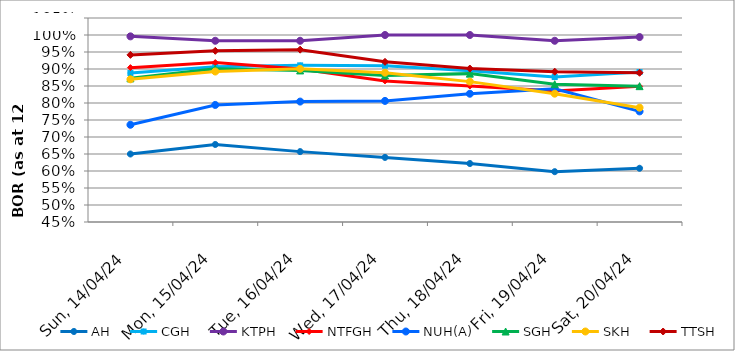
| Category | AH | CGH | KTPH | NTFGH | NUH(A) | SGH | SKH | TTSH |
|---|---|---|---|---|---|---|---|---|
| 2024-04-14 | 0.65 | 0.888 | 0.996 | 0.904 | 0.736 | 0.872 | 0.87 | 0.942 |
| 2024-04-15 | 0.678 | 0.907 | 0.983 | 0.919 | 0.794 | 0.901 | 0.893 | 0.954 |
| 2024-04-16 | 0.657 | 0.911 | 0.983 | 0.9 | 0.804 | 0.896 | 0.901 | 0.957 |
| 2024-04-17 | 0.64 | 0.91 | 1 | 0.865 | 0.806 | 0.881 | 0.889 | 0.921 |
| 2024-04-18 | 0.622 | 0.895 | 1 | 0.85 | 0.827 | 0.886 | 0.863 | 0.901 |
| 2024-04-19 | 0.598 | 0.876 | 0.983 | 0.835 | 0.842 | 0.855 | 0.827 | 0.892 |
| 2024-04-20 | 0.608 | 0.891 | 0.994 | 0.849 | 0.775 | 0.85 | 0.786 | 0.889 |